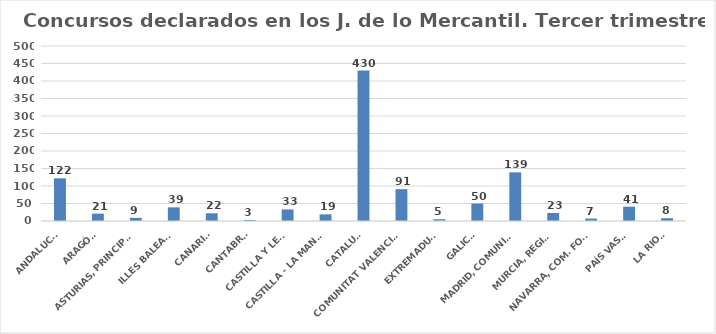
| Category | Series 0 |
|---|---|
| ANDALUCÍA | 122 |
| ARAGÓN | 21 |
| ASTURIAS, PRINCIPADO | 9 |
| ILLES BALEARS | 39 |
| CANARIAS | 22 |
| CANTABRIA | 3 |
| CASTILLA Y LEÓN | 33 |
| CASTILLA - LA MANCHA | 19 |
| CATALUÑA | 430 |
| COMUNITAT VALENCIANA | 91 |
| EXTREMADURA | 5 |
| GALICIA | 50 |
| MADRID, COMUNIDAD | 139 |
| MURCIA, REGIÓN | 23 |
| NAVARRA, COM. FORAL | 7 |
| PAÍS VASCO | 41 |
| LA RIOJA | 8 |